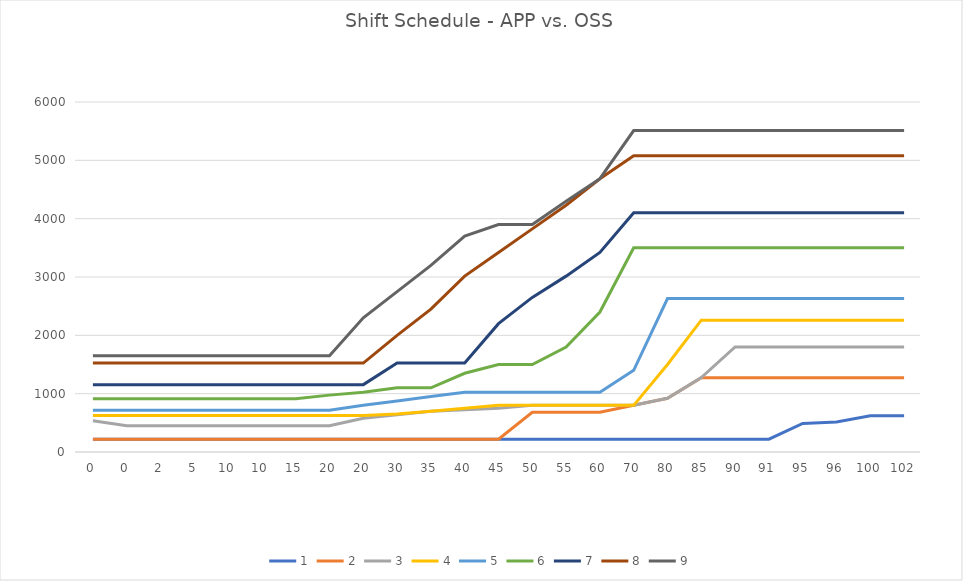
| Category | 1 | 2 | 3 | 4 | 5 | 6 | 7 | 8 | 9 |
|---|---|---|---|---|---|---|---|---|---|
| 0.0 | 220 | 220 | 535 | 625 | 715 | 915 | 1155 | 1525 | 1650 |
| 0.0 | 220 | 220 | 450 | 625 | 715 | 915 | 1155 | 1525 | 1650 |
| 2.0 | 220 | 220 | 450 | 625 | 715 | 915 | 1155 | 1525 | 1650 |
| 5.0 | 220 | 220 | 450 | 625 | 715 | 915 | 1155 | 1525 | 1650 |
| 10.0 | 220 | 220 | 450 | 625 | 715 | 915 | 1155 | 1525 | 1650 |
| 10.0 | 220 | 220 | 450 | 625 | 715 | 915 | 1155 | 1525 | 1650 |
| 15.0 | 220 | 220 | 450 | 625 | 715 | 915 | 1155 | 1525 | 1650 |
| 20.0 | 220 | 220 | 450 | 625 | 715 | 975 | 1155 | 1525 | 1650 |
| 20.0 | 220 | 220 | 580 | 625 | 800 | 1025 | 1155 | 1525 | 2300 |
| 30.0 | 220 | 220 | 640 | 650 | 875 | 1100 | 1525 | 2000 | 2750 |
| 35.0 | 220 | 220 | 700 | 700 | 950 | 1100 | 1525 | 2450 | 3200 |
| 40.0 | 220 | 220 | 725 | 750 | 1025 | 1350 | 1525 | 3015 | 3700 |
| 45.0 | 220 | 220 | 750 | 800 | 1025 | 1500 | 2200 | 3420 | 3900 |
| 50.0 | 220 | 680 | 800 | 800 | 1025 | 1500 | 2650 | 3825 | 3900 |
| 55.0 | 220 | 680 | 800 | 800 | 1025 | 1800 | 3015 | 4230 | 4300 |
| 60.0 | 220 | 680 | 800 | 800 | 1025 | 2400 | 3420 | 4685 | 4685 |
| 70.0 | 220 | 800 | 800 | 800 | 1400 | 3500 | 4100 | 5080 | 5510 |
| 80.0 | 220 | 920 | 920 | 1500 | 2630 | 3500 | 4100 | 5080 | 5510 |
| 85.0 | 220 | 1275 | 1275 | 2260 | 2630 | 3500 | 4100 | 5080 | 5510 |
| 90.0 | 220 | 1275 | 1800 | 2260 | 2630 | 3500 | 4100 | 5080 | 5510 |
| 91.0 | 220 | 1275 | 1800 | 2260 | 2630 | 3500 | 4100 | 5080 | 5510 |
| 95.0 | 490 | 1275 | 1800 | 2260 | 2630 | 3500 | 4100 | 5080 | 5510 |
| 96.0 | 515 | 1275 | 1800 | 2260 | 2630 | 3500 | 4100 | 5080 | 5510 |
| 100.0 | 620 | 1275 | 1800 | 2260 | 2630 | 3500 | 4100 | 5080 | 5510 |
| 102.0 | 620 | 1275 | 1800 | 2260 | 2630 | 3500 | 4100 | 5080 | 5510 |